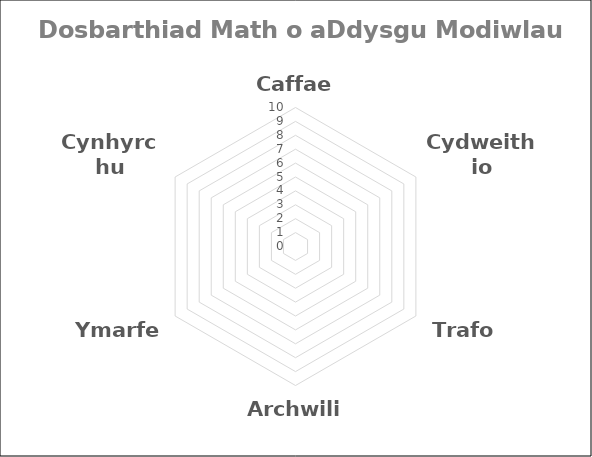
| Category | Series 0 | Caffael |
|---|---|---|
| Caffael | 0 | 0 |
| Cydweithio | 0 | 0 |
| Trafod | 0 | 0 |
| Archwilio | 0 | 0 |
| Ymarfer | 0 | 0 |
| Cynhyrchu | 0 | 0 |